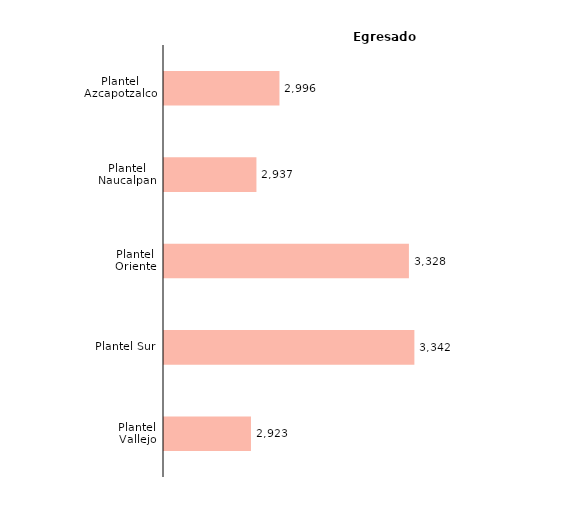
| Category | Series 0 |
|---|---|
| Plantel Vallejo | 2923 |
| Plantel Sur | 3342 |
| Plantel Oriente | 3328 |
| Plantel Naucalpan | 2937 |
| Plantel Azcapotzalco | 2996 |